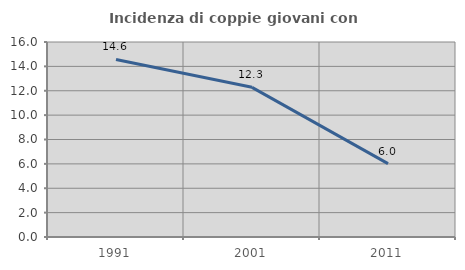
| Category | Incidenza di coppie giovani con figli |
|---|---|
| 1991.0 | 14.57 |
| 2001.0 | 12.281 |
| 2011.0 | 6.024 |